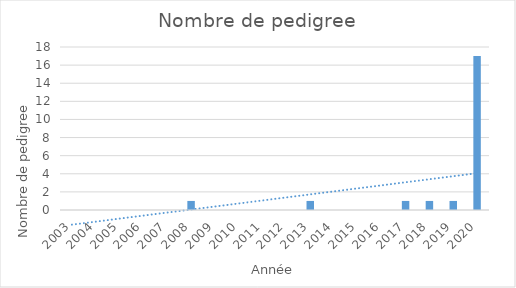
| Category | Series 0 |
|---|---|
| 2003.0 | 0 |
| 2004.0 | 0 |
| 2005.0 | 0 |
| 2006.0 | 0 |
| 2007.0 | 0 |
| 2008.0 | 1 |
| 2009.0 | 0 |
| 2010.0 | 0 |
| 2011.0 | 0 |
| 2012.0 | 0 |
| 2013.0 | 1 |
| 2014.0 | 0 |
| 2015.0 | 0 |
| 2016.0 | 0 |
| 2017.0 | 1 |
| 2018.0 | 1 |
| 2019.0 | 1 |
| 2020.0 | 17 |